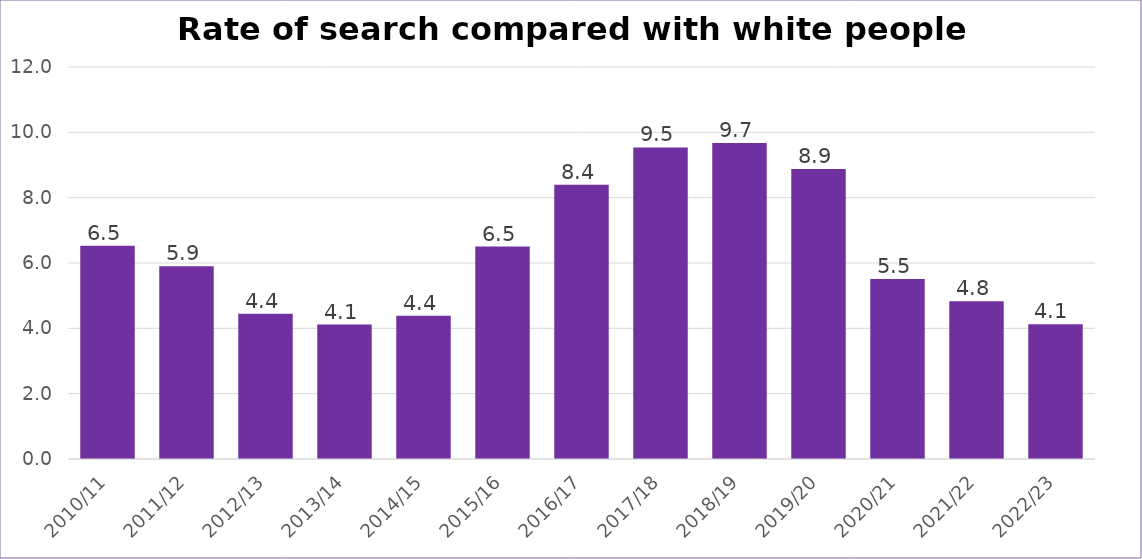
| Category | Series 0 |
|---|---|
| 2010/11 | 6.529 |
| 2011/12 | 5.898 |
| 2012/13 | 4.45 |
| 2013/14 | 4.117 |
| 2014/15 | 4.383 |
| 2015/16 | 6.502 |
| 2016/17 | 8.397 |
| 2017/18 | 9.537 |
| 2018/19 | 9.676 |
| 2019/20 | 8.878 |
| 2020/21 | 5.513 |
| 2021/22 | 4.829 |
| 2022/23 | 4.124 |